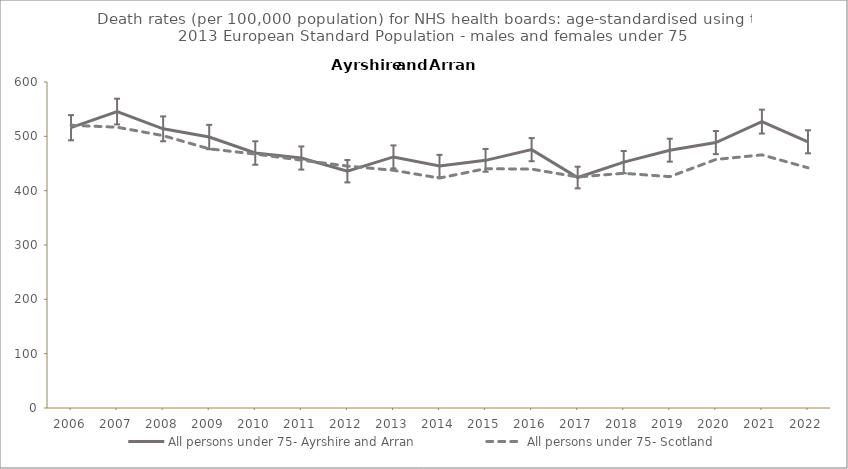
| Category | All persons under 75- Ayrshire and Arran | All persons under 75- Scotland |
|---|---|---|
| 2006.0 | 515.9 | 520.4 |
| 2007.0 | 545.6 | 516.8 |
| 2008.0 | 513.8 | 501.3 |
| 2009.0 | 498.7 | 477 |
| 2010.0 | 469.3 | 467.4 |
| 2011.0 | 460.1 | 456.1 |
| 2012.0 | 435.8 | 445.3 |
| 2013.0 | 462.1 | 437.5 |
| 2014.0 | 445.3 | 423.2 |
| 2015.0 | 455.8 | 440.5 |
| 2016.0 | 475.5 | 439.7 |
| 2017.0 | 424.2 | 425.2 |
| 2018.0 | 452.5 | 432 |
| 2019.0 | 474.5 | 425.8 |
| 2020.0 | 488.5 | 457.4 |
| 2021.0 | 527.1 | 465.9 |
| 2022.0 | 489.9 | 442.1 |